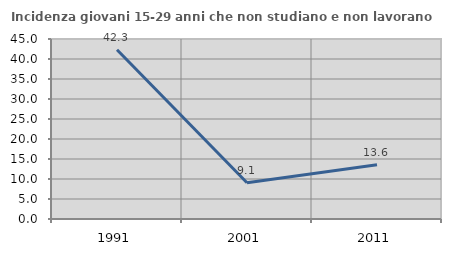
| Category | Incidenza giovani 15-29 anni che non studiano e non lavorano  |
|---|---|
| 1991.0 | 42.322 |
| 2001.0 | 9.067 |
| 2011.0 | 13.579 |